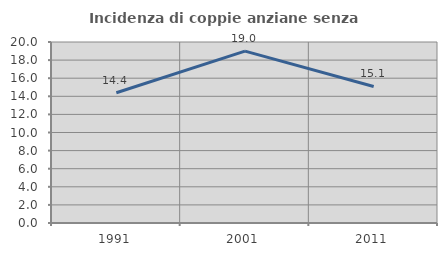
| Category | Incidenza di coppie anziane senza figli  |
|---|---|
| 1991.0 | 14.388 |
| 2001.0 | 18.996 |
| 2011.0 | 15.086 |